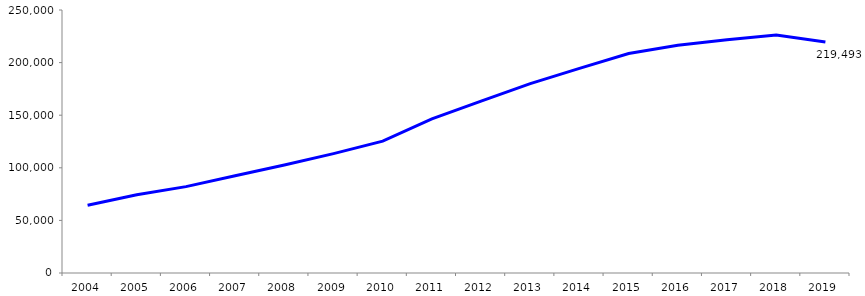
| Category | 2004 2005 2006 2007 2008 2009 2010 2011 2012 2013 2014 2015 2016 2017 2018 2019 |
|---|---|
| 2004 | 64403 |
| 2005 | 74333 |
| 2006 | 82122 |
| 2007 | 92379 |
| 2008 | 102639 |
| 2009 | 113506 |
| 2010 | 125313 |
| 2011 | 146465 |
| 2012 | 163377 |
| 2013 | 180010 |
| 2014 | 194532 |
| 2015 | 208664 |
| 2016 | 216505 |
| 2017 | 221679 |
| 2018 | 226146 |
| 2019 | 219493 |